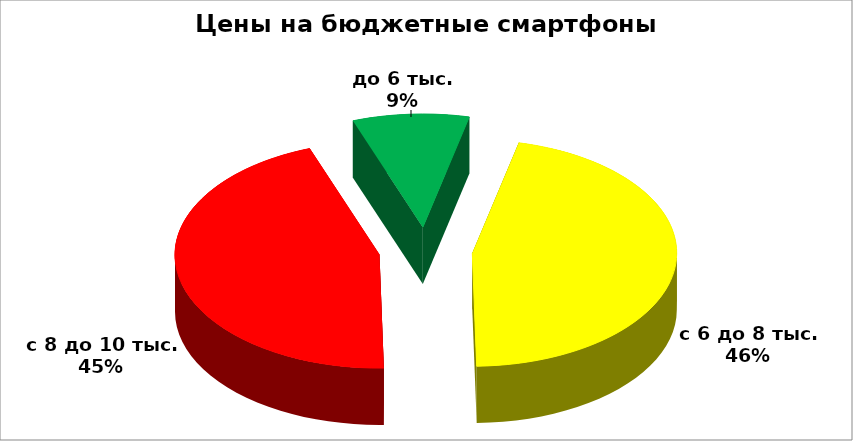
| Category | Series 0 |
|---|---|
| до 6 тыс. | 15 |
| с 6 до 8 тыс. | 75 |
| с 8 до 10 тыс. | 73 |